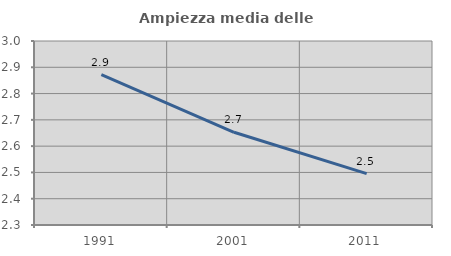
| Category | Ampiezza media delle famiglie |
|---|---|
| 1991.0 | 2.872 |
| 2001.0 | 2.653 |
| 2011.0 | 2.496 |